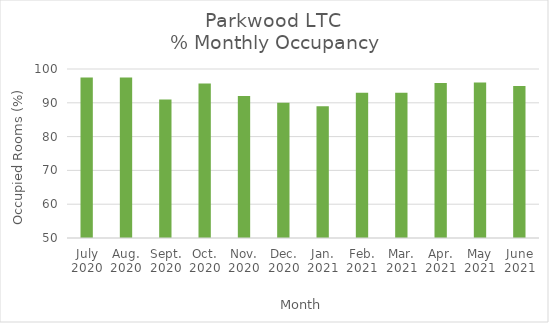
| Category | % Monthly Occupancy |
|---|---|
| July
2020 | 97.5 |
| Aug.
2020 | 97.5 |
| Sept.
2020 | 91 |
| Oct.
2020 | 95.7 |
| Nov.
2020 | 92 |
| Dec.
2020 | 90 |
| Jan.
2021 | 89 |
| Feb.
2021 | 93 |
| Mar.
2021 | 93 |
| Apr.
2021 | 95.83 |
| May
2021 | 96 |
| June
2021 | 95 |